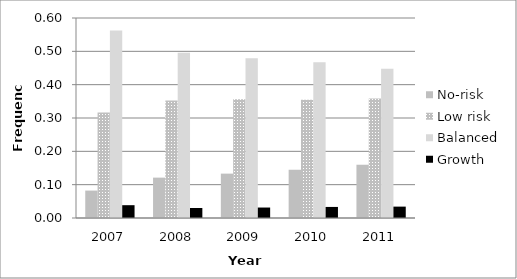
| Category | No-risk | Low risk | Balanced | Growth |
|---|---|---|---|---|
| 2007.0 | 0.082 | 0.316 | 0.563 | 0.038 |
| 2008.0 | 0.121 | 0.353 | 0.496 | 0.03 |
| 2009.0 | 0.133 | 0.356 | 0.48 | 0.031 |
| 2010.0 | 0.145 | 0.355 | 0.467 | 0.033 |
| 2011.0 | 0.16 | 0.359 | 0.447 | 0.034 |